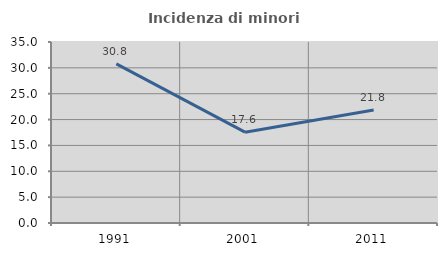
| Category | Incidenza di minori stranieri |
|---|---|
| 1991.0 | 30.769 |
| 2001.0 | 17.568 |
| 2011.0 | 21.833 |